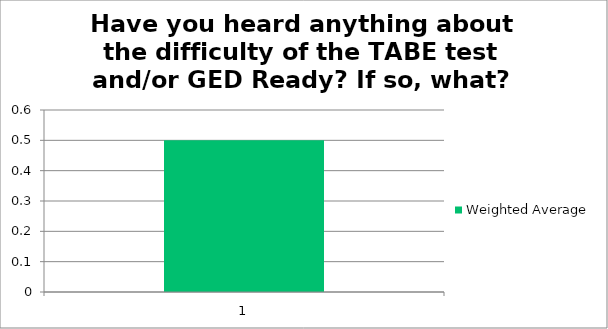
| Category | Weighted Average |
|---|---|
| 1.0 | 0.5 |